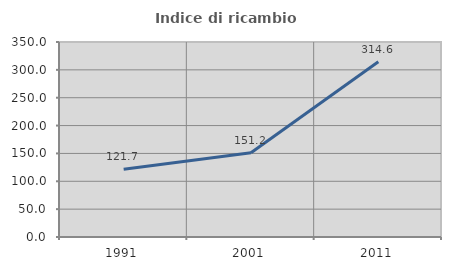
| Category | Indice di ricambio occupazionale  |
|---|---|
| 1991.0 | 121.724 |
| 2001.0 | 151.245 |
| 2011.0 | 314.625 |